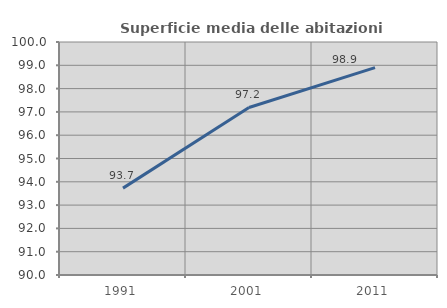
| Category | Superficie media delle abitazioni occupate |
|---|---|
| 1991.0 | 93.729 |
| 2001.0 | 97.189 |
| 2011.0 | 98.898 |